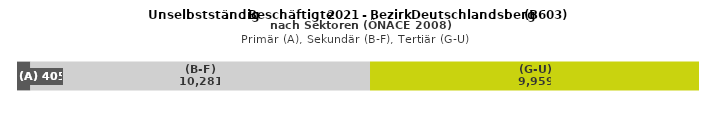
| Category | (A) | (B-F) | (G-U) |
|---|---|---|---|
| 0 | 405 | 10281 | 9959 |